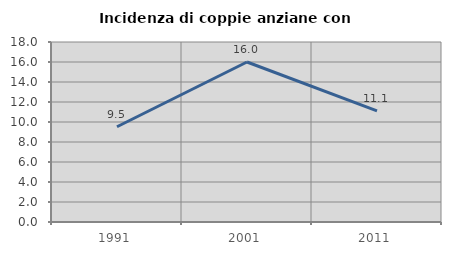
| Category | Incidenza di coppie anziane con figli |
|---|---|
| 1991.0 | 9.524 |
| 2001.0 | 16 |
| 2011.0 | 11.111 |